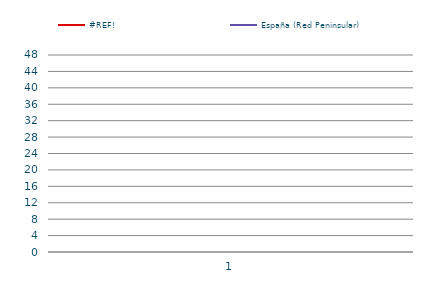
| Category | #REF! | España (Red Peninsular) |
|---|---|---|
| 0 | 1 | 1 |